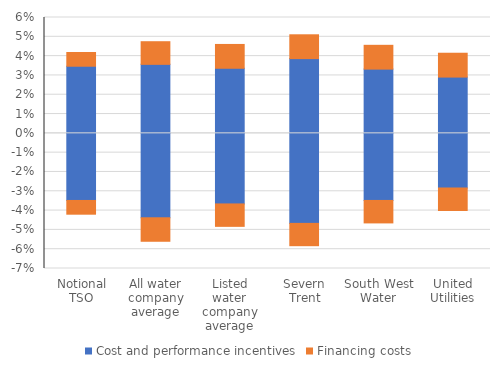
| Category | Cost and performance incentives | Financing costs |
|---|---|---|
| Notional TSO | 0.035 | 0.007 |
| All water company average | 0.036 | 0.012 |
| Listed water company average | 0.034 | 0.012 |
| Severn Trent | 0.039 | 0.012 |
| South West Water | 0.033 | 0.012 |
| United Utilities | 0.029 | 0.012 |